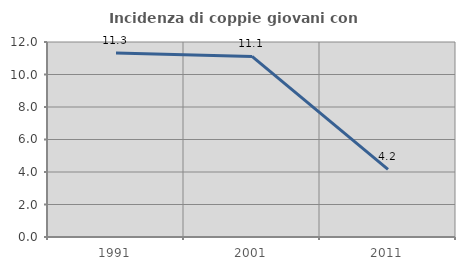
| Category | Incidenza di coppie giovani con figli |
|---|---|
| 1991.0 | 11.321 |
| 2001.0 | 11.111 |
| 2011.0 | 4.167 |